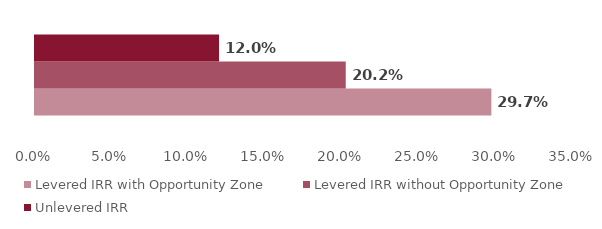
| Category | Levered IRR with Opportunity Zone | Levered IRR without Opportunity Zone | Unlevered IRR |
|---|---|---|---|
| 0 | 0.297 | 0.202 | 0.12 |